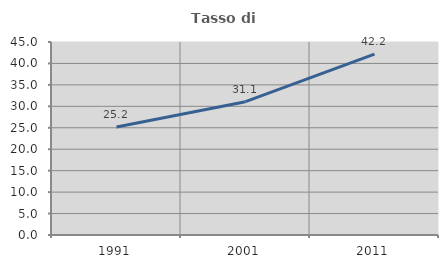
| Category | Tasso di occupazione   |
|---|---|
| 1991.0 | 25.18 |
| 2001.0 | 31.081 |
| 2011.0 | 42.163 |